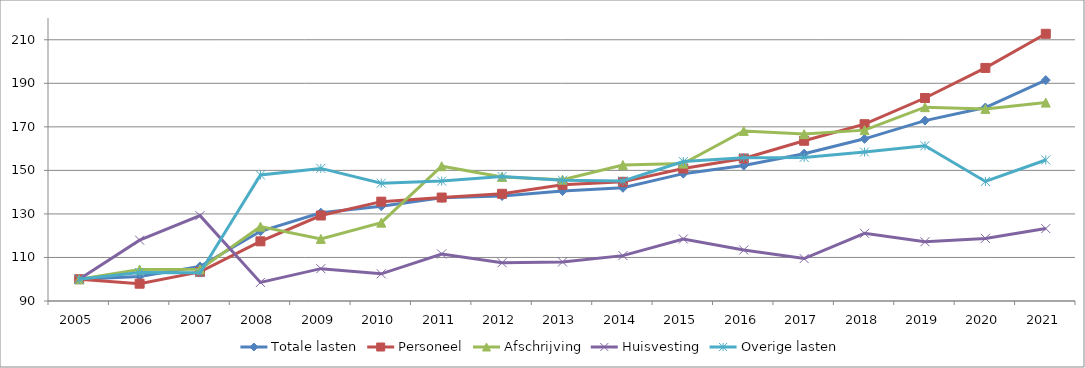
| Category | Totale lasten | Personeel | Afschrijving | Huisvesting | Overige lasten |
|---|---|---|---|---|---|
| 2005.0 | 100 | 100 | 100 | 100 | 100 |
| 2006.0 | 101.301 | 97.949 | 104.506 | 117.948 | 103.111 |
| 2007.0 | 105.876 | 103.387 | 104.584 | 129.213 | 102.991 |
| 2008.0 | 122.03 | 117.407 | 124.16 | 98.531 | 147.864 |
| 2009.0 | 130.557 | 129.274 | 118.537 | 104.856 | 150.913 |
| 2010.0 | 133.535 | 135.64 | 125.999 | 102.477 | 144.12 |
| 2011.0 | 137.387 | 137.525 | 151.917 | 111.609 | 145.079 |
| 2012.0 | 138.226 | 139.248 | 147.003 | 107.587 | 147.164 |
| 2013.0 | 140.495 | 143.356 | 145.723 | 107.943 | 145.466 |
| 2014.0 | 142 | 144.734 | 152.46 | 110.841 | 145.114 |
| 2015.0 | 148.497 | 150.859 | 153.115 | 118.473 | 154.039 |
| 2016.0 | 152.229 | 155.452 | 168.123 | 113.419 | 155.827 |
| 2017.0 | 157.659 | 163.599 | 166.664 | 109.487 | 155.956 |
| 2018.0 | 164.501 | 171.221 | 168.495 | 121.086 | 158.442 |
| 2019.0 | 172.878 | 183.247 | 179.033 | 117.22 | 161.294 |
| 2020.0 | 178.854 | 197.066 | 178.239 | 118.759 | 144.921 |
| 2021.0 | 191.464 | 212.737 | 181.15 | 123.258 | 154.774 |